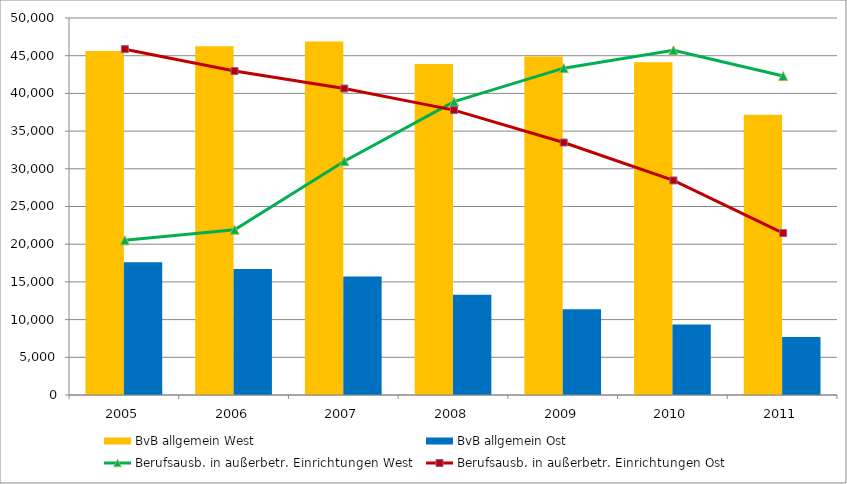
| Category | BvB allgemein West | BvB allgemein Ost |
|---|---|---|
| 2005.0 | 45627 | 17596 |
| 2006.0 | 46251 | 16715 |
| 2007.0 | 46887 | 15717 |
| 2008.0 | 43902 | 13309 |
| 2009.0 | 44908 | 11364 |
| 2010.0 | 44137 | 9337 |
| 2011.0 | 37181.167 | 7679 |